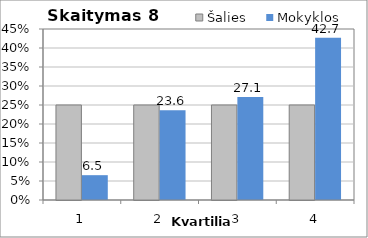
| Category | Šalies | Mokyklos |
|---|---|---|
| 1.0 | 25 | 6.533 |
| 2.0 | 25 | 23.618 |
| 3.0 | 25 | 27.136 |
| 4.0 | 25 | 42.714 |